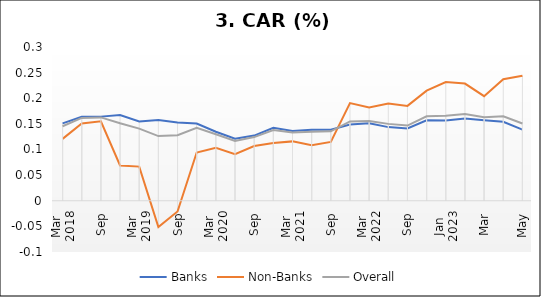
| Category | Banks | Non-Banks | Overall |
|---|---|---|---|
| 0 | 0.151 | 0.121 | 0.145 |
| 1 | 0.164 | 0.151 | 0.162 |
| 2 | 0.164 | 0.155 | 0.163 |
| 3 | 0.167 | 0.069 | 0.151 |
| 4 | 0.155 | 0.067 | 0.141 |
| 5 | 0.158 | -0.051 | 0.126 |
| 6 | 0.153 | -0.021 | 0.128 |
| 7 | 0.151 | 0.094 | 0.142 |
| 8 | 0.135 | 0.103 | 0.13 |
| 9 | 0.121 | 0.091 | 0.116 |
| 10 | 0.127 | 0.107 | 0.124 |
| 11 | 0.142 | 0.113 | 0.138 |
| 12 | 0.136 | 0.116 | 0.133 |
| 13 | 0.139 | 0.109 | 0.134 |
| 14 | 0.139 | 0.115 | 0.136 |
| 15 | 0.149 | 0.191 | 0.155 |
| 16 | 0.151 | 0.182 | 0.156 |
| 17 | 0.144 | 0.19 | 0.15 |
| 18 | 0.141 | 0.185 | 0.147 |
| 19 | 0.157 | 0.215 | 0.165 |
| 20 | 0.156 | 0.232 | 0.166 |
| 21 | 0.161 | 0.229 | 0.169 |
| 22 | 0.157 | 0.204 | 0.163 |
| 23 | 0.154 | 0.237 | 0.165 |
| 24 | 0.139 | 0.244 | 0.151 |